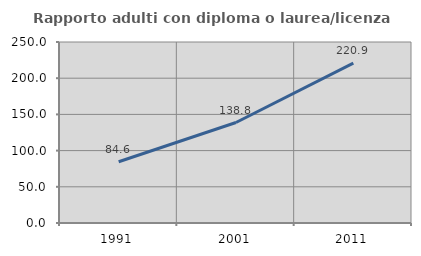
| Category | Rapporto adulti con diploma o laurea/licenza media  |
|---|---|
| 1991.0 | 84.615 |
| 2001.0 | 138.806 |
| 2011.0 | 220.861 |